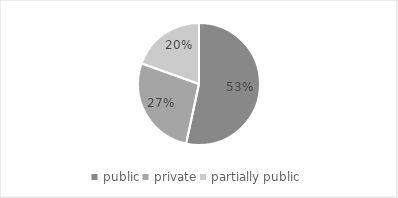
| Category | Series 1 |
|---|---|
| public | 0.534 |
| private | 0.271 |
| partially public | 0.195 |